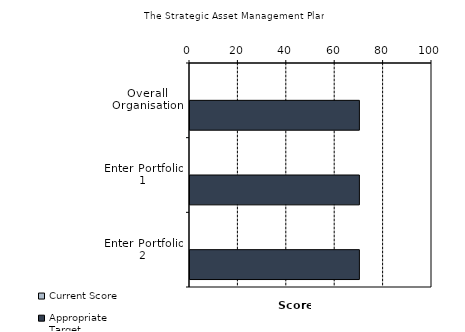
| Category | Current Score | Appropriate Target |
|---|---|---|
| Overall Organisation | 0 | 70 |
| Enter Portfolio 1 | 0 | 70 |
| Enter Portfolio 2 | 0 | 70 |